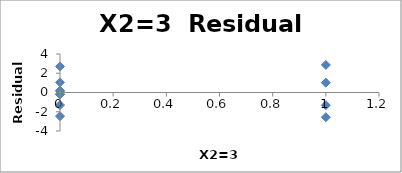
| Category | Series 0 |
|---|---|
| 0.0 | 2.71 |
| 0.0 | 1.053 |
| 0.0 | -1.303 |
| 0.0 | -2.46 |
| 0.0 | 0.185 |
| 0.0 | -0.172 |
| 0.0 | 0.172 |
| 0.0 | -0.185 |
| 1.0 | -2.565 |
| 1.0 | -1.322 |
| 1.0 | 1.022 |
| 1.0 | 2.865 |